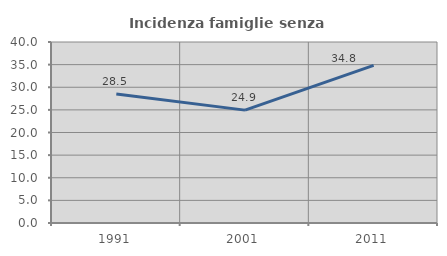
| Category | Incidenza famiglie senza nuclei |
|---|---|
| 1991.0 | 28.512 |
| 2001.0 | 24.946 |
| 2011.0 | 34.847 |